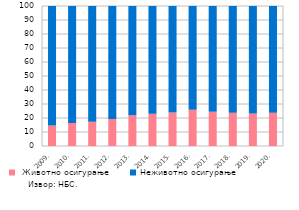
| Category |  Животно осигурање | Неживотно осигурање |
|---|---|---|
| 2009. | 14.7 | 85.3 |
| 2010. | 16.5 | 83.5 |
| 2011. | 17.4 | 82.6 |
| 2012. | 19.3 | 80.7 |
| 2013. | 22 | 78 |
| 2014. | 23.1 | 76.9 |
| 2015. | 23.9 | 76.1 |
| 2016. | 25.9 | 74.1 |
| 2017. | 24.4 | 75.6 |
| 2018. | 23.8 | 76.2 |
| 2019. | 23.3 | 76.7 |
| 2020. | 23.8 | 76.2 |